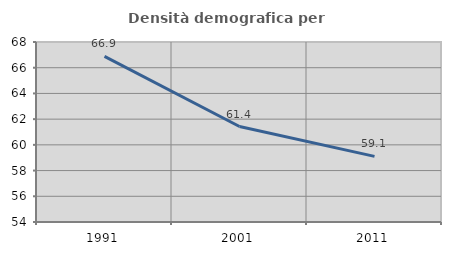
| Category | Densità demografica |
|---|---|
| 1991.0 | 66.878 |
| 2001.0 | 61.428 |
| 2011.0 | 59.102 |